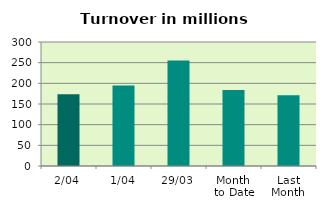
| Category | Series 0 |
|---|---|
| 2/04 | 173.322 |
| 1/04 | 194.739 |
| 29/03 | 255.094 |
| Month 
to Date | 184.03 |
| Last
Month | 171.15 |